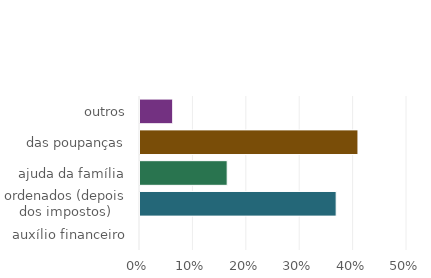
| Category | Series 0 |
|---|---|
| auxílio financeiro | 0 |
| ordenados (depois dos impostos) | 0.367 |
| ajuda da família | 0.163 |
| das poupanças | 0.408 |
| outros | 0.061 |